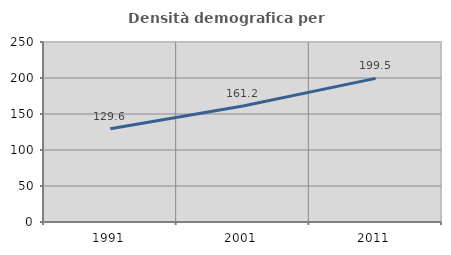
| Category | Densità demografica |
|---|---|
| 1991.0 | 129.555 |
| 2001.0 | 161.234 |
| 2011.0 | 199.467 |